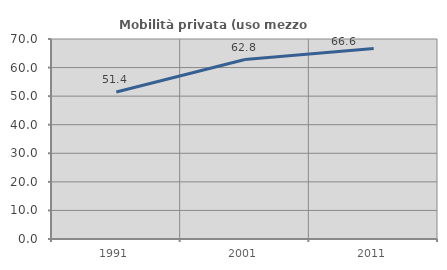
| Category | Mobilità privata (uso mezzo privato) |
|---|---|
| 1991.0 | 51.433 |
| 2001.0 | 62.814 |
| 2011.0 | 66.64 |